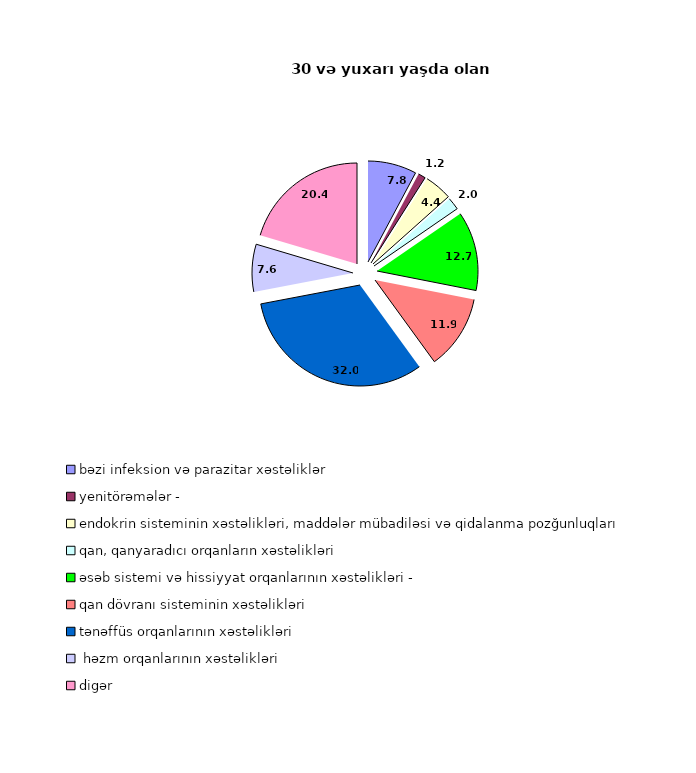
| Category | Series 0 |
|---|---|
| bəzi infeksion və parazitar xəstəliklər | 7.8 |
| yenitörəmələr - | 1.2 |
| endokrin sisteminin xəstəlikləri, maddələr mübadiləsi və qidalanma pozğunluqları  | 4.4 |
| qan, qanyaradıcı orqanların xəstəlikləri | 2 |
| əsəb sistemi və hissiyyat orqanlarının xəstəlikləri -  | 12.7 |
| qan dövranı sisteminin xəstəlikləri  | 11.9 |
| tənəffüs orqanlarının xəstəlikləri | 32 |
|  həzm orqanlarının xəstəlikləri | 7.6 |
| digər | 20.4 |